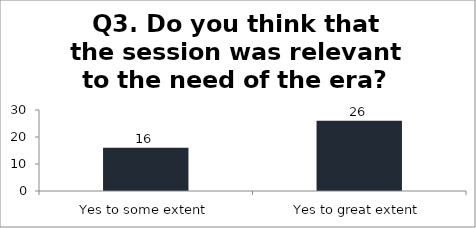
| Category | Q3. Do you think that the session was relevant to the need of the era? |
|---|---|
| Yes to some extent | 16 |
| Yes to great extent | 26 |